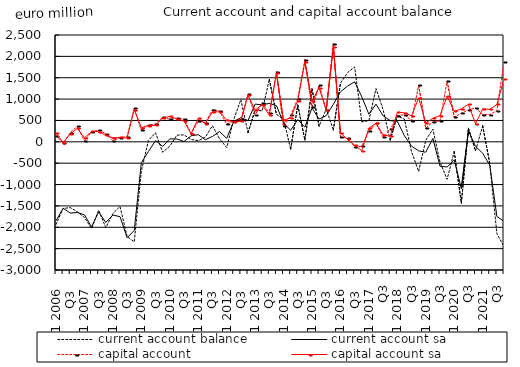
| Category | current account balance | current account sa | capital account | capital account sa |
|---|---|---|---|---|
| Q1 2006 | -1933.772 | -1847.905 | 141.877 | 200.833 |
| Q2  | -1560.514 | -1553.976 | -33.042 | -17.142 |
| Q3  | -1539.337 | -1668.125 | 213.48 | 182.659 |
| Q4  | -1637.061 | -1654.546 | 363.087 | 313.69 |
| Q1 2007 | -1772.529 | -1709.024 | 21.369 | 91.37 |
| Q2  | -2029.917 | -1990.134 | 233.738 | 242.216 |
| Q3  | -1598.23 | -1640.534 | 273.829 | 240.203 |
| Q4  | -2007.425 | -1888.115 | 193.952 | 152.343 |
| Q1 2008 | -1677.406 | -1713.753 | 23.928 | 92.778 |
| Q2  | -1514.363 | -1751.991 | 100.645 | 102.152 |
| Q3  | -2216.755 | -2243.625 | 121.671 | 90.515 |
| Q4  | -2341.825 | -2075.06 | 785.988 | 754.789 |
| Q1 2009 | -685.333 | -487.51 | 268.49 | 332.16 |
| Q2  | 33.643 | -227.062 | 387.117 | 381.752 |
| Q3  | 212.021 | 29.723 | 418.355 | 384.545 |
| Q4  | -244.886 | -108.156 | 580.318 | 560.814 |
| Q1 2010 | -101.996 | 68.97 | 529.415 | 593.9 |
| Q2  | 155.904 | 66.342 | 550.143 | 538.41 |
| Q3  | 162.12 | 6.603 | 534.111 | 488.056 |
| Q4  | 55.595 | 140.848 | 194.043 | 185.998 |
| Q1 2011 | 26.432 | 167.115 | 475.702 | 551.235 |
| Q2  | 107.182 | 48.873 | 442.88 | 428.17 |
| Q3  | 374.92 | 125.721 | 753.673 | 700.594 |
| Q4  | 68.824 | 239.103 | 721.876 | 700.8 |
| Q1 2012 | -134.026 | 81.706 | 415.413 | 512.264 |
| Q2  | 528.366 | 476.83 | 492.549 | 464.328 |
| Q3  | 987.065 | 563.032 | 528.416 | 482.678 |
| Q4  | 215.87 | 497.294 | 1112.143 | 1086.025 |
| Q1 2013 | 744.59 | 882.609 | 628.236 | 744.221 |
| Q2  | 723.392 | 865.228 | 916.069 | 866.893 |
| Q3  | 1461.302 | 900.095 | 669.775 | 623.996 |
| Q4  | 640.842 | 846.797 | 1637.517 | 1602.897 |
| Q1 2014 | 530.698 | 436.097 | 360.257 | 500.868 |
| Q2  | -171.153 | 270.845 | 618.169 | 565.044 |
| Q3  | 857.121 | 519.415 | 1010.275 | 963.248 |
| Q4  | 43.516 | 342.852 | 1919.028 | 1867.619 |
| Q1 2015 | 1240.807 | 792.694 | 808.826 | 951.07 |
| Q2  | 364.762 | 533.907 | 1318.453 | 1264.531 |
| Q3  | 765.877 | 611.289 | 740.813 | 736.398 |
| Q4 | 276.677 | 877.876 | 2291.425 | 2218.519 |
| Q1 2016 | 1371.892 | 1170.247 | 114.484 | 211.619 |
| Q2  | 1618.635 | 1306.008 | 84.228 | 54.428 |
| Q3  | 1751.593 | 1405.061 | -116.512 | -80.615 |
| Q4 | 467.214 | 1052.351 | -103.331 | -206.284 |
| Q1 2017 | 494.732 | 647.132 | 248.436 | 320.422 |
| Q2  | 1246.738 | 880.207 | 434.588 | 435.132 |
| Q3 | 754.382 | 607.586 | 101.299 | 163.985 |
| Q4 | 40.063 | 496.552 | 291.095 | 128.907 |
| Q1 2018 | 611.641 | 478.794 | 609.354 | 692.228 |
| Q2  | 529.652 | 143.036 | 637.739 | 680.196 |
| Q3 | -232.524 | -101.213 | 496.753 | 607.8 |
| Q4 | -692.851 | -211.147 | 1319.072 | 1026.382 |
| Q1 2019 | 38.532 | -244.401 | 321.628 | 444.367 |
| Q2  | 296.883 | 79.14 | 468.924 | 548.926 |
| Q3 | -476.617 | -570.38 | 490.085 | 615.203 |
| Q4 | -876.848 | -588.726 | 1419.935 | 1066.861 |
| Q1 2020 | -229.942 | -427.619 | 579.355 | 714.044 |
| Q2  | -1434.965 | -1092.884 | 667.722 | 769.458 |
| Q3 | 317.294 | 253.96 | 750.767 | 878.184 |
| Q4 | -210.837 | -105.939 | 795.012 | 420.751 |
| Q1 2021 | 373.855 | -266.497 | 637.967 | 771.793 |
| Q2  | -509.686 | -548.037 | 639.222 | 759.435 |
| Q3 | -2147.527 | -1747.403 | 727.155 | 873.618 |
| Q4 | -2452.419 | -1861.603 | 1878.075 | 1463.744 |